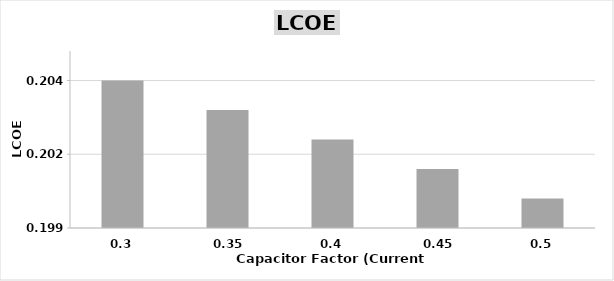
| Category | Current Turbine |
|---|---|
| 0.3 | 0.204 |
| 0.35 | 0.203 |
| 0.4 | 0.202 |
| 0.45 | 0.201 |
| 0.5 | 0.2 |